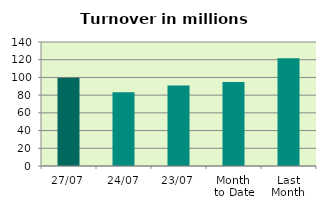
| Category | Series 0 |
|---|---|
| 27/07 | 99.739 |
| 24/07 | 83.278 |
| 23/07 | 90.963 |
| Month 
to Date | 94.844 |
| Last
Month | 121.74 |